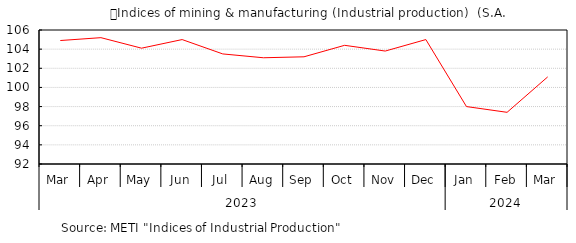
| Category | Series 0 |
|---|---|
| 0 | 104.9 |
| 1 | 105.2 |
| 2 | 104.1 |
| 3 | 105 |
| 4 | 103.5 |
| 5 | 103.1 |
| 6 | 103.2 |
| 7 | 104.4 |
| 8 | 103.8 |
| 9 | 105 |
| 10 | 98 |
| 11 | 97.4 |
| 12 | 101.1 |